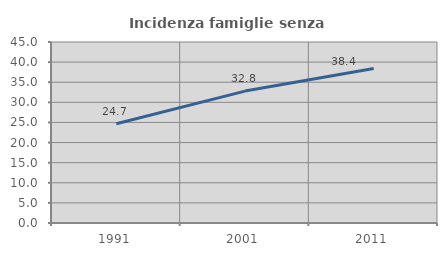
| Category | Incidenza famiglie senza nuclei |
|---|---|
| 1991.0 | 24.674 |
| 2001.0 | 32.794 |
| 2011.0 | 38.408 |